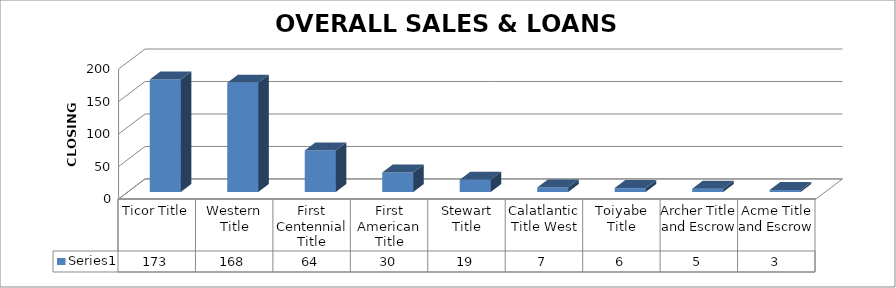
| Category | Series 0 |
|---|---|
| Ticor Title | 173 |
| Western Title | 168 |
| First Centennial Title | 64 |
| First American Title | 30 |
| Stewart Title | 19 |
| Calatlantic Title West | 7 |
| Toiyabe Title | 6 |
| Archer Title and Escrow | 5 |
| Acme Title and Escrow | 3 |